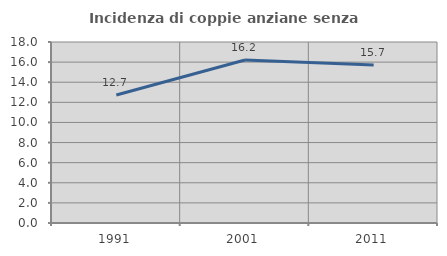
| Category | Incidenza di coppie anziane senza figli  |
|---|---|
| 1991.0 | 12.73 |
| 2001.0 | 16.204 |
| 2011.0 | 15.708 |